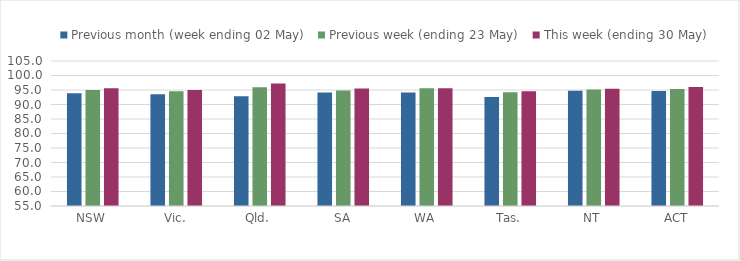
| Category | Previous month (week ending 02 May) | Previous week (ending 23 May) | This week (ending 30 May) |
|---|---|---|---|
| NSW | 93.891 | 94.988 | 95.574 |
| Vic. | 93.515 | 94.573 | 95.017 |
| Qld. | 92.87 | 95.949 | 97.268 |
| SA | 94.105 | 94.798 | 95.542 |
| WA | 94.163 | 95.645 | 95.6 |
| Tas. | 92.617 | 94.201 | 94.566 |
| NT | 94.729 | 95.197 | 95.446 |
| ACT | 94.623 | 95.325 | 96.073 |